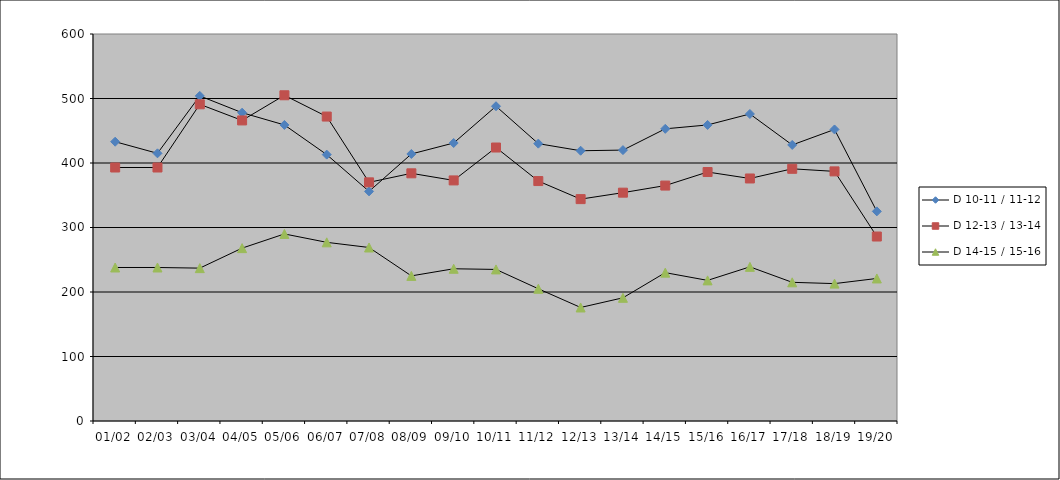
| Category | D 10-11 / 11-12 | D 12-13 / 13-14 | D 14-15 / 15-16 |
|---|---|---|---|
| 01/02 | 433 | 393 | 238 |
| 02/03 | 415 | 393 | 238 |
| 03/04 | 504 | 491 | 237 |
| 04/05 | 478 | 466 | 268 |
| 05/06 | 459 | 505 | 290 |
| 06/07 | 413 | 472 | 277 |
| 07/08 | 356 | 370 | 269 |
| 08/09 | 414 | 384 | 225 |
| 09/10 | 431 | 373 | 236 |
| 10/11 | 488 | 424 | 235 |
| 11/12 | 430 | 372 | 205 |
| 12/13 | 419 | 344 | 176 |
| 13/14 | 420 | 354 | 191 |
| 14/15 | 453 | 365 | 230 |
| 15/16 | 459 | 386 | 218 |
| 16/17 | 476 | 376 | 239 |
| 17/18 | 428 | 391 | 215 |
| 18/19 | 452 | 387 | 213 |
| 19/20 | 325 | 286 | 221 |